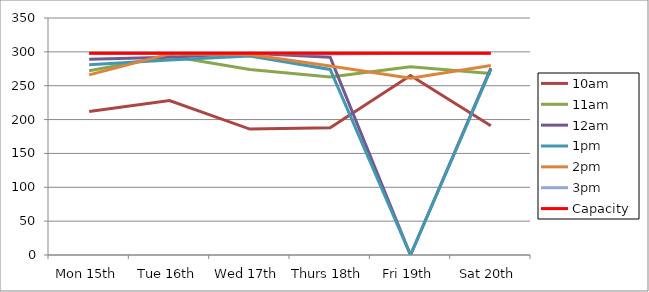
| Category | 9am | 10am | 11am | 12am | 1pm | 2pm | 3pm | 4pm | 5pm | Capacity |
|---|---|---|---|---|---|---|---|---|---|---|
| Mon 15th |  | 212 | 272 | 289 | 281 | 266 | 298 |  |  | 298 |
| Tue 16th |  | 228 | 294 | 292 | 288 | 297 | 298 |  |  | 298 |
| Wed 17th |  | 186 | 274 | 298 | 294 | 296 | 298 |  |  | 298 |
| Thurs 18th |  | 188 | 263 | 292 | 274 | 279 | 297 |  |  | 298 |
| Fri 19th |  | 265 | 278 | 0 | 0 | 261 | 298 |  |  | 298 |
| Sat 20th |  | 191 | 268 | 276 | 274 | 280 | 298 |  |  | 298 |